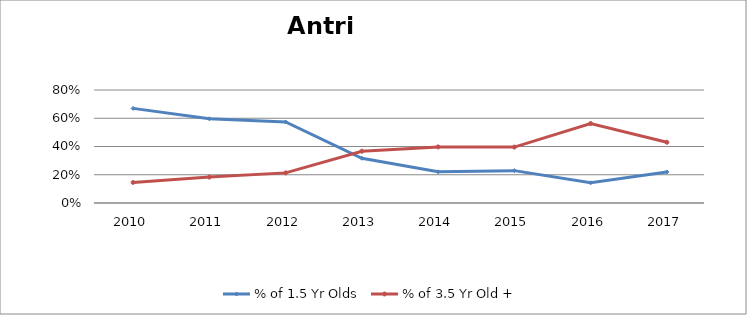
| Category | % of 1.5 Yr Olds | % of 3.5 Yr Old + |
|---|---|---|
| 2010.0 | 0.67 | 0.146 |
| 2011.0 | 0.596 | 0.183 |
| 2012.0 | 0.574 | 0.213 |
| 2013.0 | 0.317 | 0.367 |
| 2014.0 | 0.221 | 0.397 |
| 2015.0 | 0.229 | 0.396 |
| 2016.0 | 0.143 | 0.562 |
| 2017.0 | 0.22 | 0.43 |